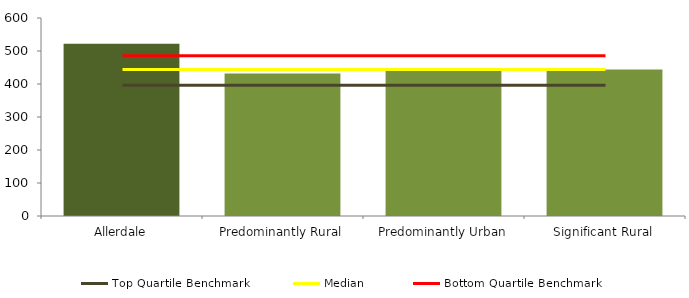
| Category | Series 0 |
|---|---|
| Allerdale | 522.2 |
| Predominantly Rural | 432.139 |
| Predominantly Urban | 447.148 |
| Significant Rural | 444.042 |